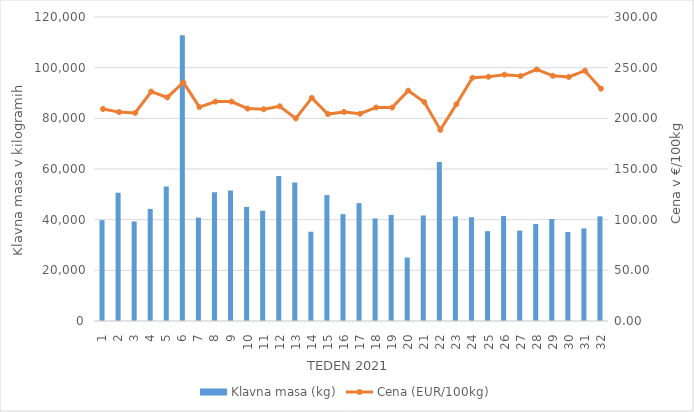
| Category | Klavna masa (kg) |
|---|---|
| 1.0 | 39814 |
| 2.0 | 50603 |
| 3.0 | 39295 |
| 4.0 | 44250 |
| 5.0 | 53061 |
| 6.0 | 112816 |
| 7.0 | 40829 |
| 8.0 | 50775 |
| 9.0 | 51535 |
| 10.0 | 45040 |
| 11.0 | 43536 |
| 12.0 | 57246 |
| 13.0 | 54680 |
| 14.0 | 35237 |
| 15.0 | 49721 |
| 16.0 | 42177 |
| 17.0 | 46525 |
| 18.0 | 40491 |
| 19.0 | 41888 |
| 20.0 | 25048 |
| 21.0 | 41651 |
| 22.0 | 62774 |
| 23.0 | 41297 |
| 24.0 | 40971 |
| 25.0 | 35465 |
| 26.0 | 41489 |
| 27.0 | 35675 |
| 28.0 | 38316 |
| 29.0 | 40265 |
| 30.0 | 35146 |
| 31.0 | 36548 |
| 32.0 | 41314 |